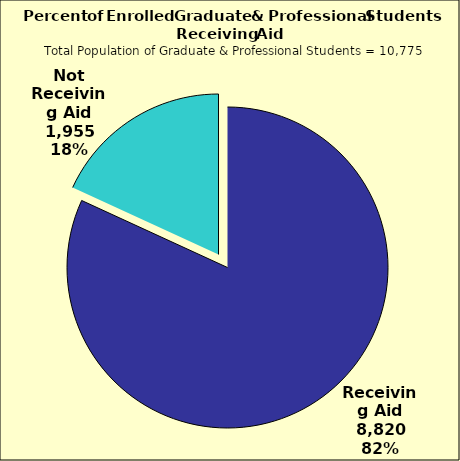
| Category | Series 0 |
|---|---|
| Receiving Aid | 8820 |
| Not Receiving Aid | 1955 |